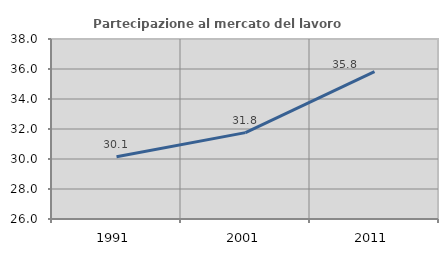
| Category | Partecipazione al mercato del lavoro  femminile |
|---|---|
| 1991.0 | 30.147 |
| 2001.0 | 31.758 |
| 2011.0 | 35.821 |